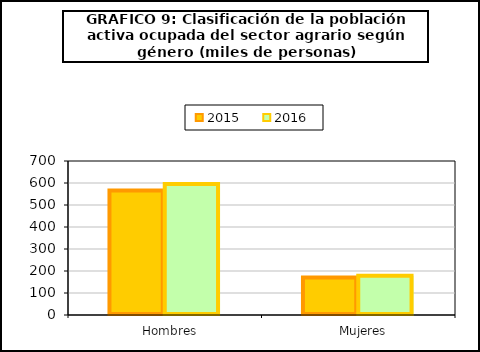
| Category | 2015 | 2016 |
|---|---|---|
|    Hombres | 565.825 | 595.9 |
|    Mujeres | 170.95 | 178.7 |